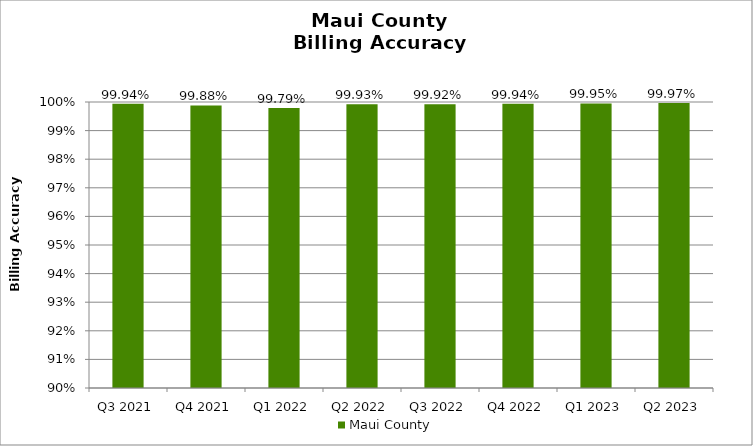
| Category | Maui County |
|---|---|
| Q3 2021 | 0.999 |
| Q4 2021 | 0.999 |
| Q1 2022 | 0.998 |
| Q2 2022 | 0.999 |
| Q3 2022 | 0.999 |
| Q4 2022 | 0.999 |
| Q1 2023 | 0.999 |
| Q2 2023 | 1 |